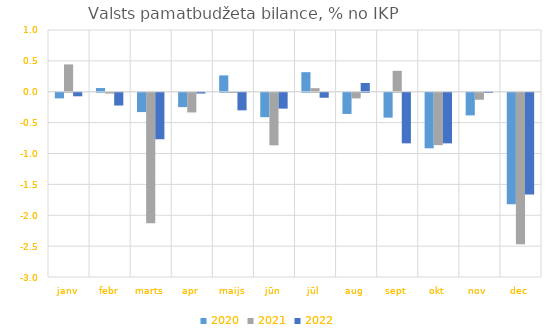
| Category | 2020 | 2021 | 2022 |
|---|---|---|---|
| janv | -0.092 | 0.443 | -0.057 |
| febr | 0.06 | -0.014 | -0.207 |
| marts | -0.313 | -2.113 | -0.753 |
| apr | -0.233 | -0.319 | -0.013 |
| maijs | 0.265 | -0.004 | -0.285 |
| jūn | -0.395 | -0.851 | -0.257 |
| jūl | 0.317 | 0.058 | -0.081 |
| aug | -0.343 | -0.091 | 0.142 |
| sept | -0.403 | 0.339 | -0.819 |
| okt | -0.9 | -0.848 | -0.82 |
| nov | -0.367 | -0.113 | 0.006 |
| dec | -1.806 | -2.452 | -1.646 |